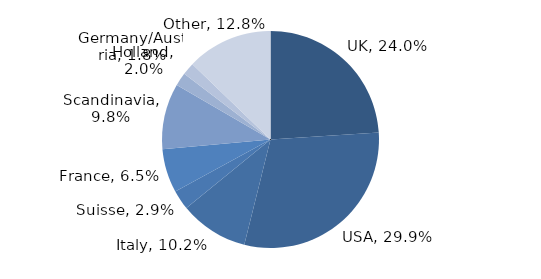
| Category | Investment Style |
|---|---|
| UK | 0.24 |
| USA | 0.299 |
| Italy | 0.102 |
| Suisse | 0.029 |
| France | 0.065 |
| Scandinavia | 0.098 |
| Holland | 0.02 |
| Germany/Austria | 0.018 |
| Other | 0.128 |